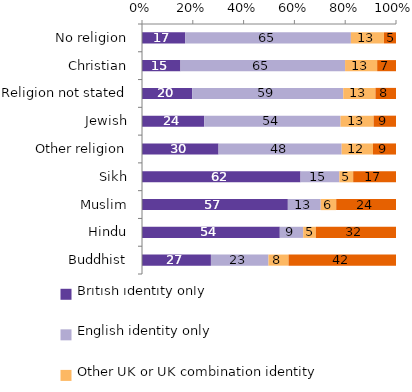
| Category | British identity only | English identity only | Other UK or UK combination identity | Foreign identity only |
|---|---|---|---|---|
| No religion | 16.98 | 65.264 | 13.021 | 4.734 |
| Christian | 15.152 | 64.798 | 12.632 | 7.418 |
| Religion not stated | 19.74 | 59.494 | 12.678 | 8.088 |
| Jewish | 24.482 | 53.692 | 13.002 | 8.825 |
| Other religion | 30.136 | 48.473 | 12.341 | 9.05 |
| Sikh | 62.418 | 15.282 | 5.441 | 16.858 |
| Muslim | 57.416 | 12.945 | 6.101 | 23.538 |
| Hindu | 54.248 | 9.227 | 4.964 | 31.561 |
| Buddhist | 27.139 | 22.647 | 7.914 | 42.299 |